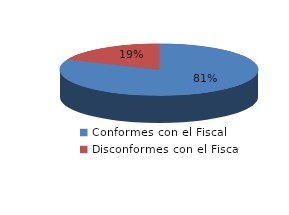
| Category | Series 0 |
|---|---|
| 0 | 1315 |
| 1 | 299 |